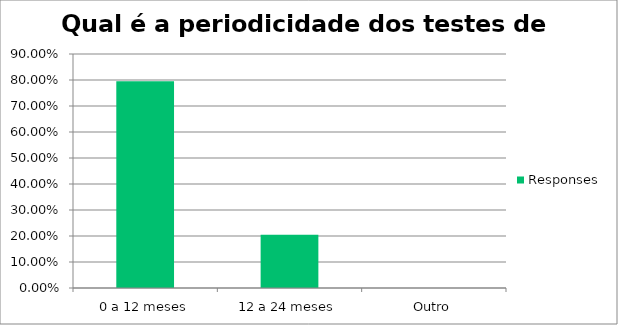
| Category | Responses |
|---|---|
| 0 a 12 meses | 0.796 |
| 12 a 24 meses | 0.204 |
| Outro | 0 |